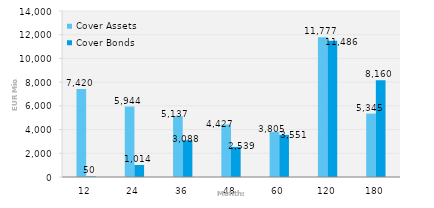
| Category | Cover Assets | Cover Bonds |
|---|---|---|
| 12.0 | 7420.448 | 50 |
| 24.0 | 5943.857 | 1014.3 |
| 36.0 | 5136.567 | 3088.049 |
| 48.0 | 4426.76 | 2539.1 |
| 60.0 | 3805.453 | 3551 |
| 120.0 | 11777.398 | 11486.155 |
| 180.0 | 5344.535 | 8160.02 |